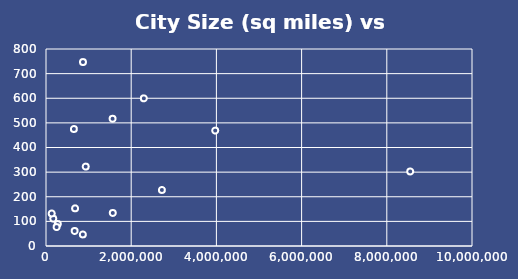
| Category | Size |
|---|---|
| 8550405.0 | 302.6 |
| 3971883.0 | 468.7 |
| 2720546.0 | 227.6 |
| 2296224.0 | 599.6 |
| 1563025.0 | 516.7 |
| 1567442.0 | 134.1 |
| 931830.0 | 322.48 |
| 868031.0 | 747 |
| 864816.0 | 46.9 |
| 682545.0 | 153 |
| 672228.0 | 61 |
| 654610.0 | 475.1 |
| 277348.0 | 89.1 |
| 248951.0 | 76.8 |
| 170674.0 | 111 |
| 133803.0 | 132.2 |